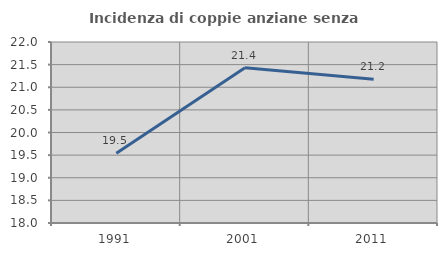
| Category | Incidenza di coppie anziane senza figli  |
|---|---|
| 1991.0 | 19.54 |
| 2001.0 | 21.429 |
| 2011.0 | 21.176 |